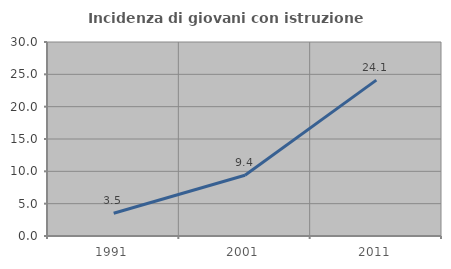
| Category | Incidenza di giovani con istruzione universitaria |
|---|---|
| 1991.0 | 3.526 |
| 2001.0 | 9.398 |
| 2011.0 | 24.107 |